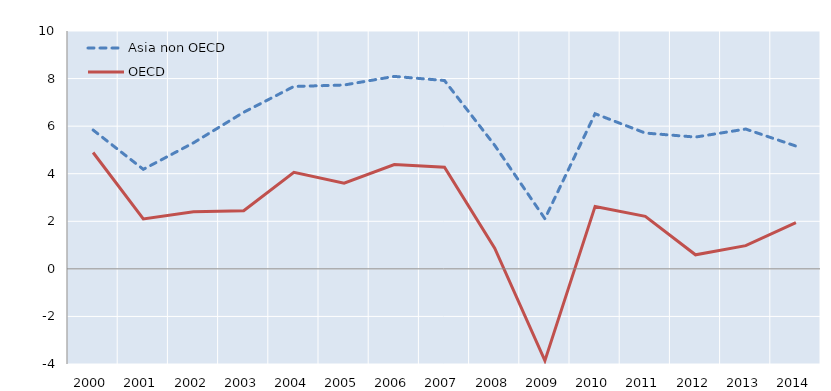
| Category | Asia non OECD | OECD |
|---|---|---|
| 2000.0 | 5.837 | 4.891 |
| 2001.0 | 4.185 | 2.099 |
| 2002.0 | 5.299 | 2.404 |
| 2003.0 | 6.583 | 2.447 |
| 2004.0 | 7.668 | 4.062 |
| 2005.0 | 7.729 | 3.603 |
| 2006.0 | 8.091 | 4.383 |
| 2007.0 | 7.917 | 4.272 |
| 2008.0 | 5.194 | 0.867 |
| 2009.0 | 2.108 | -3.858 |
| 2010.0 | 6.522 | 2.626 |
| 2011.0 | 5.709 | 2.207 |
| 2012.0 | 5.541 | 0.591 |
| 2013.0 | 5.878 | 0.977 |
| 2014.0 | 5.163 | 1.948 |